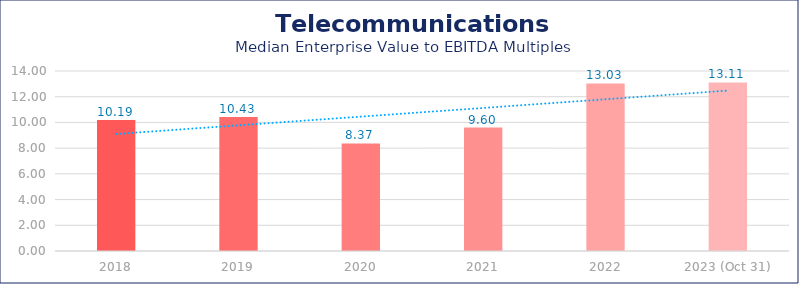
| Category | Telecommunications |
|---|---|
| 2018 | 10.19 |
| 2019 | 10.43 |
| 2020 | 8.37 |
| 2021 | 9.6 |
| 2022 | 13.03 |
| 2023 (Oct 31) | 13.11 |